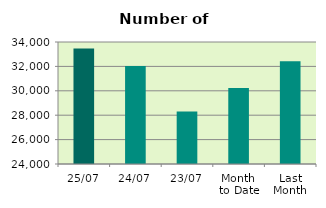
| Category | Series 0 |
|---|---|
| 25/07 | 33464 |
| 24/07 | 32032 |
| 23/07 | 28304 |
| Month 
to Date | 30234 |
| Last
Month | 32421.5 |